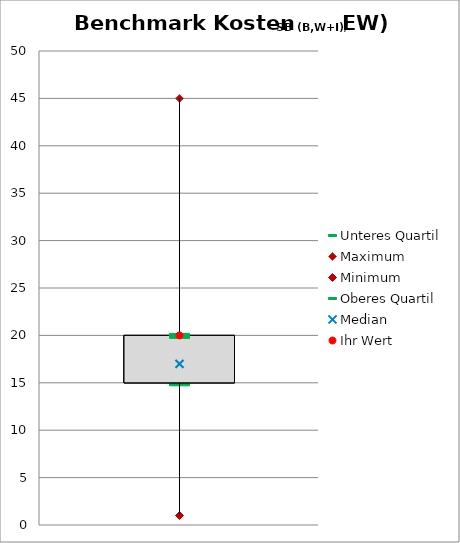
| Category | Unteres Quartil | Maximum | Minimum | Oberes Quartil |
|---|---|---|---|---|
| Alter SB | 15 | 45 | 1 | 20 |